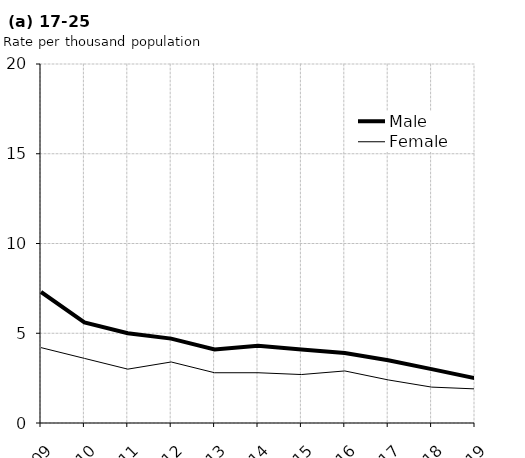
| Category | Male | Female |
|---|---|---|
| 2009.0 | 7.3 | 4.2 |
| 2010.0 | 5.6 | 3.6 |
| 2011.0 | 5 | 3 |
| 2012.0 | 4.7 | 3.4 |
| 2013.0 | 4.1 | 2.8 |
| 2014.0 | 4.3 | 2.8 |
| 2015.0 | 4.1 | 2.7 |
| 2016.0 | 3.9 | 2.9 |
| 2017.0 | 3.5 | 2.4 |
| 2018.0 | 3 | 2 |
| 2019.0 | 2.5 | 1.9 |